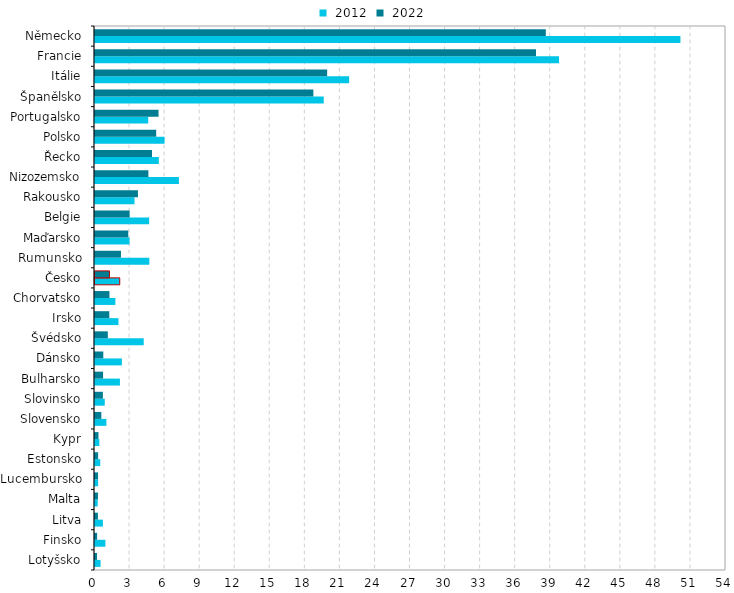
| Category |  2012 |  2022 |
|---|---|---|
| Lotyšsko | 0.476 | 0.174 |
| Finsko | 0.89 | 0.181 |
| Litva | 0.675 | 0.25 |
| Malta | 0.23 | 0.259 |
| Lucembursko | 0.267 | 0.26 |
| Estonsko | 0.448 | 0.266 |
| Kypr | 0.373 | 0.297 |
| Slovensko | 0.975 | 0.541 |
| Slovinsko | 0.835 | 0.676 |
| Bulharsko | 2.133 | 0.691 |
| Dánsko | 2.299 | 0.709 |
| Švédsko | 4.169 | 1.098 |
| Irsko | 2.008 | 1.222 |
| Chorvatsko | 1.744 | 1.235 |
| Česko | 2.117 | 1.241 |
| Rumunsko | 4.65 | 2.222 |
| Maďarsko | 2.961 | 2.845 |
| Belgie | 4.635 | 2.965 |
| Rakousko | 3.38 | 3.678 |
| Nizozemsko | 7.182 | 4.57 |
| Řecko | 5.461 | 4.877 |
| Polsko | 5.951 | 5.237 |
| Portugalsko | 4.558 | 5.437 |
| Španělsko | 19.575 | 18.686 |
| Itálie | 21.749 | 19.867 |
| Francie | 39.71 | 37.741 |
| Německo | 50.1 | 38.58 |